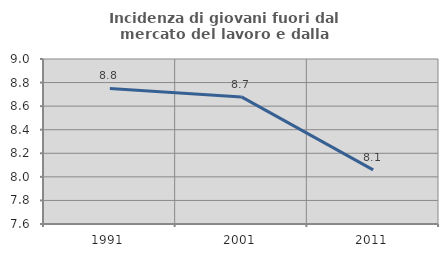
| Category | Incidenza di giovani fuori dal mercato del lavoro e dalla formazione  |
|---|---|
| 1991.0 | 8.75 |
| 2001.0 | 8.679 |
| 2011.0 | 8.059 |